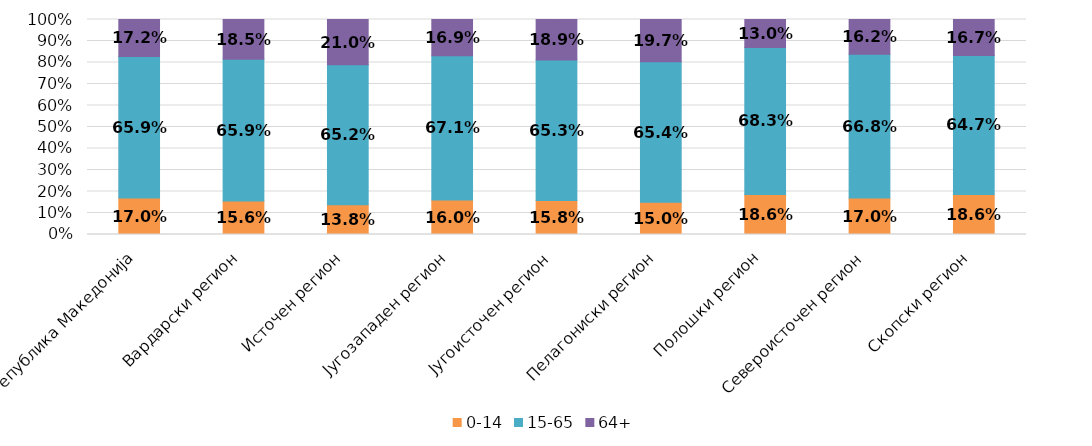
| Category | 0-14 | 15-65 | 64+ |
|---|---|---|---|
| Република Македонија | 0.17 | 0.659 | 0.172 |
| Вардарски регион | 0.156 | 0.659 | 0.185 |
| Источен регион | 0.138 | 0.652 | 0.21 |
| Југозападен регион | 0.16 | 0.671 | 0.169 |
| Југоисточен регион | 0.158 | 0.653 | 0.189 |
| Пелагониски регион | 0.15 | 0.654 | 0.197 |
| Полошки регион | 0.186 | 0.683 | 0.13 |
| Североисточен регион | 0.17 | 0.668 | 0.162 |
| Скопски регион | 0.186 | 0.647 | 0.167 |